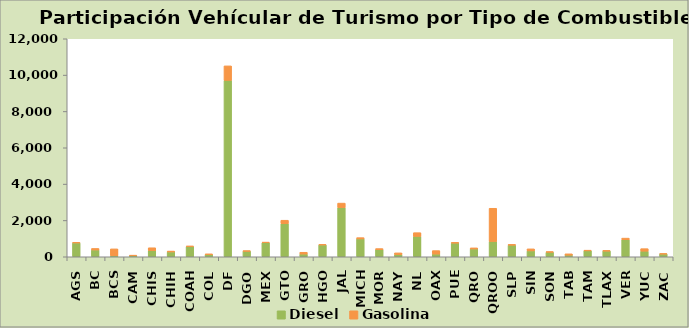
| Category | Diesel | Gasolina |
|---|---|---|
| AGS | 760 | 37 |
| BC | 372 | 86 |
| BCS | 60 | 375 |
| CAM | 59 | 27 |
| CHIS | 337 | 160 |
| CHIH | 265 | 50 |
| COAH | 562 | 28 |
| COL | 113 | 47 |
| DF | 9710 | 798 |
| DGO | 313 | 1 |
| MEX | 773 | 33 |
| GTO | 1819 | 193 |
| GRO | 149 | 100 |
| HGO | 652 | 25 |
| JAL | 2704 | 251 |
| MICH | 982 | 72 |
| MOR | 393 | 56 |
| NAY | 119 | 96 |
| NL | 1122 | 205 |
| OAX | 149 | 191 |
| PUE | 751 | 42 |
| QRO | 429 | 61 |
| QROO | 840 | 1830 |
| SLP | 638 | 43 |
| SIN | 323 | 113 |
| SON | 251 | 31 |
| TAB | 90 | 72 |
| TAM | 336 | 9 |
| TLAX | 324 | 4 |
| VER | 936 | 91 |
| YUC | 308 | 139 |
| ZAC | 154 | 16 |